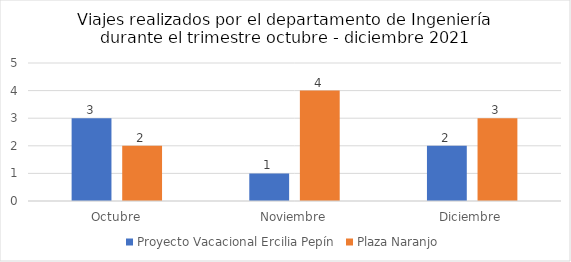
| Category | Proyecto Vacacional Ercilia Pepín | Plaza Naranjo |
|---|---|---|
| Octubre | 3 | 2 |
| Noviembre | 1 | 4 |
| Diciembre | 2 | 3 |